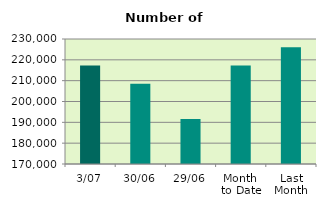
| Category | Series 0 |
|---|---|
| 3/07 | 217294 |
| 30/06 | 208524 |
| 29/06 | 191588 |
| Month 
to Date | 217294 |
| Last
Month | 226069.545 |